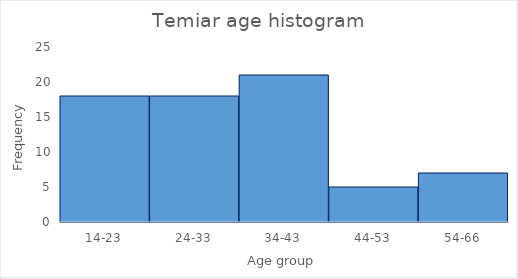
| Category | Series 0 |
|---|---|
| 14-23 | 18 |
| 24-33 | 18 |
| 34-43 | 21 |
| 44-53 | 5 |
| 54-66 | 7 |